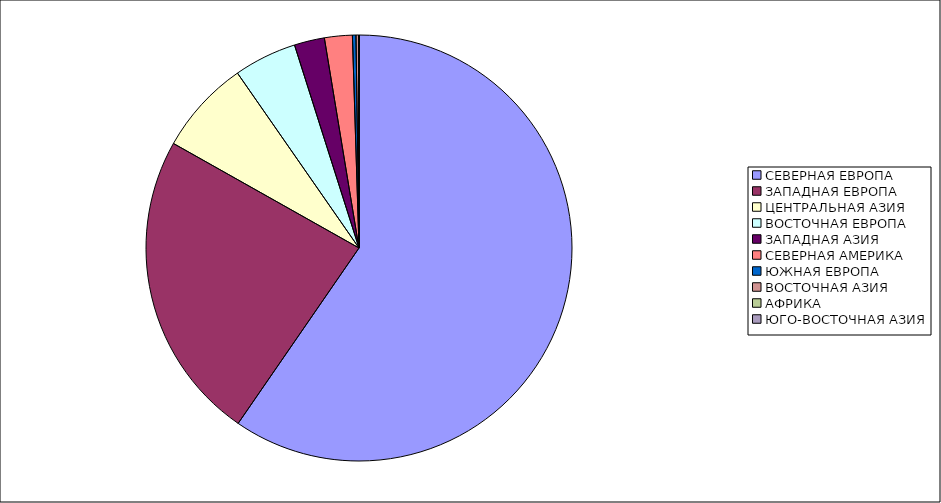
| Category | Оборот |
|---|---|
| СЕВЕРНАЯ ЕВРОПА | 59.603 |
| ЗАПАДНАЯ ЕВРОПА | 23.562 |
| ЦЕНТРАЛЬНАЯ АЗИЯ | 7.169 |
| ВОСТОЧНАЯ ЕВРОПА | 4.771 |
| ЗАПАДНАЯ АЗИЯ | 2.292 |
| СЕВЕРНАЯ АМЕРИКА | 2.109 |
| ЮЖНАЯ ЕВРОПА | 0.268 |
| ВОСТОЧНАЯ АЗИЯ | 0.223 |
| АФРИКА | 0.004 |
| ЮГО-ВОСТОЧНАЯ АЗИЯ | 0 |